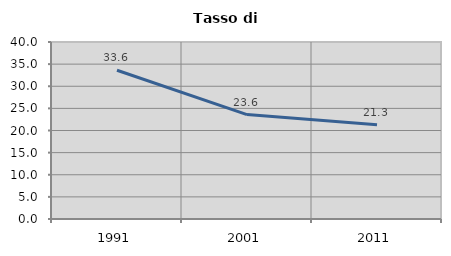
| Category | Tasso di disoccupazione   |
|---|---|
| 1991.0 | 33.607 |
| 2001.0 | 23.59 |
| 2011.0 | 21.285 |